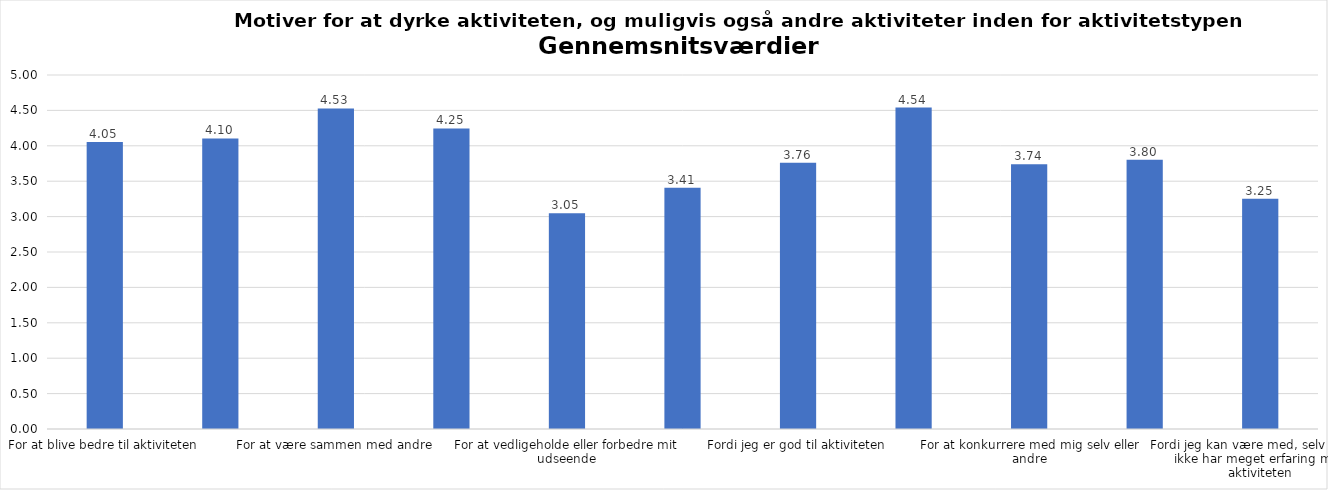
| Category | Gennemsnit |
|---|---|
| For at blive bedre til aktiviteten | 4.055 |
| For at vedligeholde eller forbedre min sundhed (fx helbred, fysisk form) | 4.105 |
| For at være sammen med andre | 4.528 |
| For at gøre noget godt for mig selv | 4.245 |
| For at vedligeholde eller forbedre mit udseende | 3.046 |
| Fordi andre i min omgangskreds opmuntrer mig til det | 3.408 |
| Fordi jeg er god til aktiviteten | 3.76 |
| Fordi jeg godt kan lide aktiviteten | 4.54 |
| For at konkurrere med mig selv eller andre | 3.739 |
| Fordi aktiviteten passer godt ind i min hverdag | 3.804 |
| Fordi jeg kan være med, selv om jeg ikke har meget erfaring med aktiviteten | 3.252 |